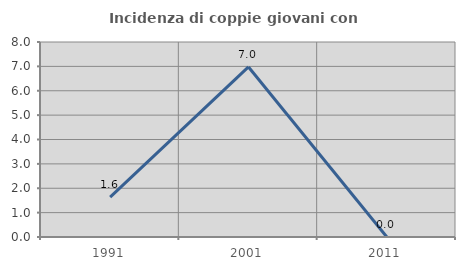
| Category | Incidenza di coppie giovani con figli |
|---|---|
| 1991.0 | 1.639 |
| 2001.0 | 6.977 |
| 2011.0 | 0 |